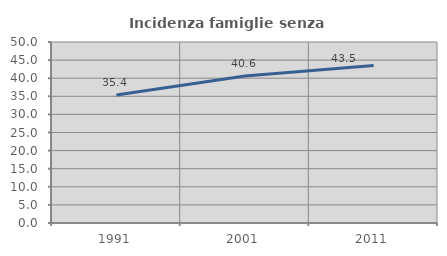
| Category | Incidenza famiglie senza nuclei |
|---|---|
| 1991.0 | 35.366 |
| 2001.0 | 40.606 |
| 2011.0 | 43.505 |